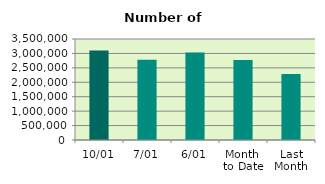
| Category | Series 0 |
|---|---|
| 10/01 | 3105260 |
| 7/01 | 2785082 |
| 6/01 | 3030466 |
| Month 
to Date | 2771191 |
| Last
Month | 2284008.087 |